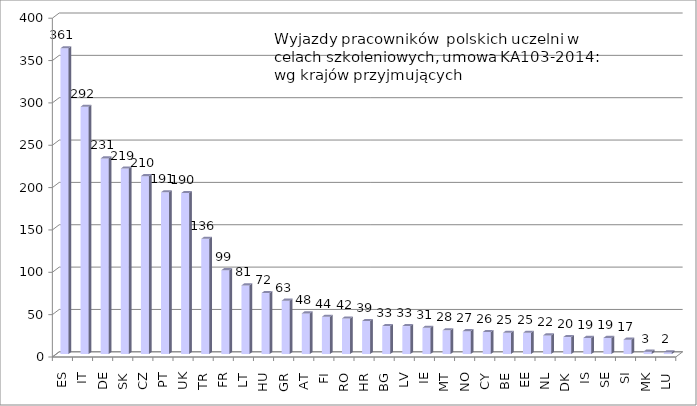
| Category | Series 0 |
|---|---|
| ES | 361 |
| IT | 292 |
| DE | 231 |
| SK | 219 |
| CZ | 210 |
| PT | 191 |
| UK | 190 |
| TR | 136 |
| FR | 99 |
| LT | 81 |
| HU | 72 |
| GR | 63 |
| AT | 48 |
| FI | 44 |
| RO | 42 |
| HR | 39 |
| BG | 33 |
| LV | 33 |
| IE | 31 |
| MT | 28 |
| NO | 27 |
| CY | 26 |
| BE | 25 |
| EE | 25 |
| NL | 22 |
| DK | 20 |
| IS | 19 |
| SE | 19 |
| SI | 17 |
| MK | 3 |
| LU | 2 |